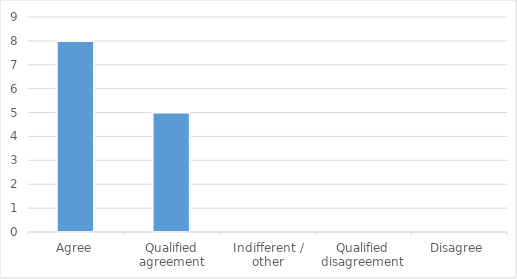
| Category | Series 0 |
|---|---|
| Agree | 8 |
| Qualified agreement | 5 |
| Indifferent / other | 0 |
| Qualified disagreement | 0 |
| Disagree | 0 |